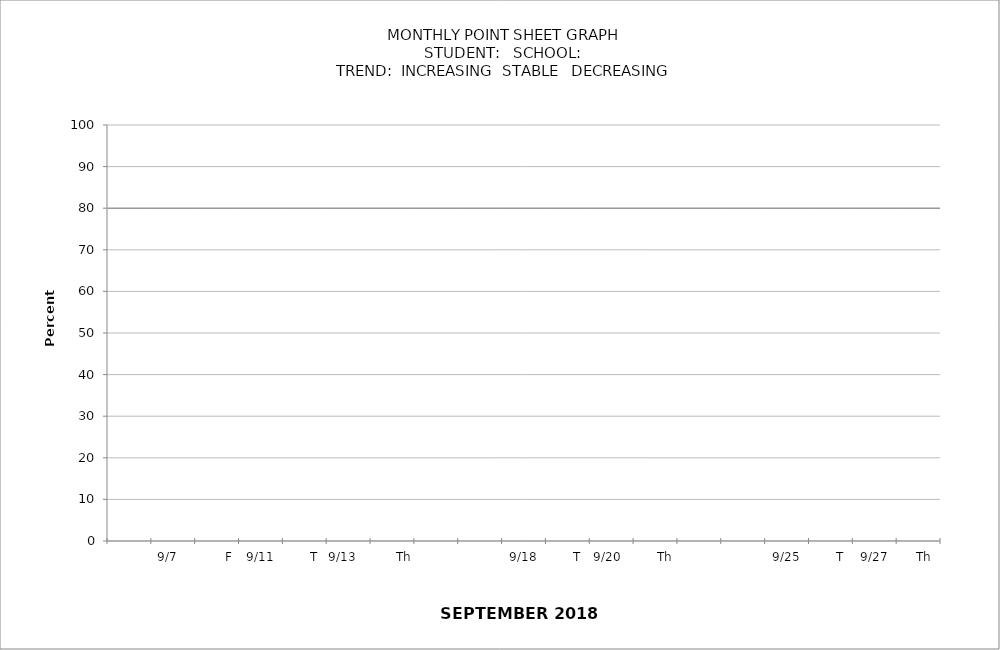
| Category | Percentage | target |
|---|---|---|
|  |  | 80 |
| 9/6          Th |  | 80 |
| 9/7            F |  | 80 |
|  |  | 80 |
| 9/11         T |  | 80 |
| 9/12         W |  | 80 |
| 9/13          Th |  | 80 |
| 9/14         F |  | 80 |
|  |  | 80 |
| 9/17          M |  | 80 |
| 9/18         T |  | 80 |
| 9/19             W |  | 80 |
| 9/20         Th |  | 80 |
| 9/21         F |  | 80 |
|  |  | 80 |
| 9/24          M |  | 80 |
| 9/25         T |  | 80 |
| 9/26        W |  | 80 |
| 9/27       Th |  | 80 |
| 9/28           F |  | 80 |